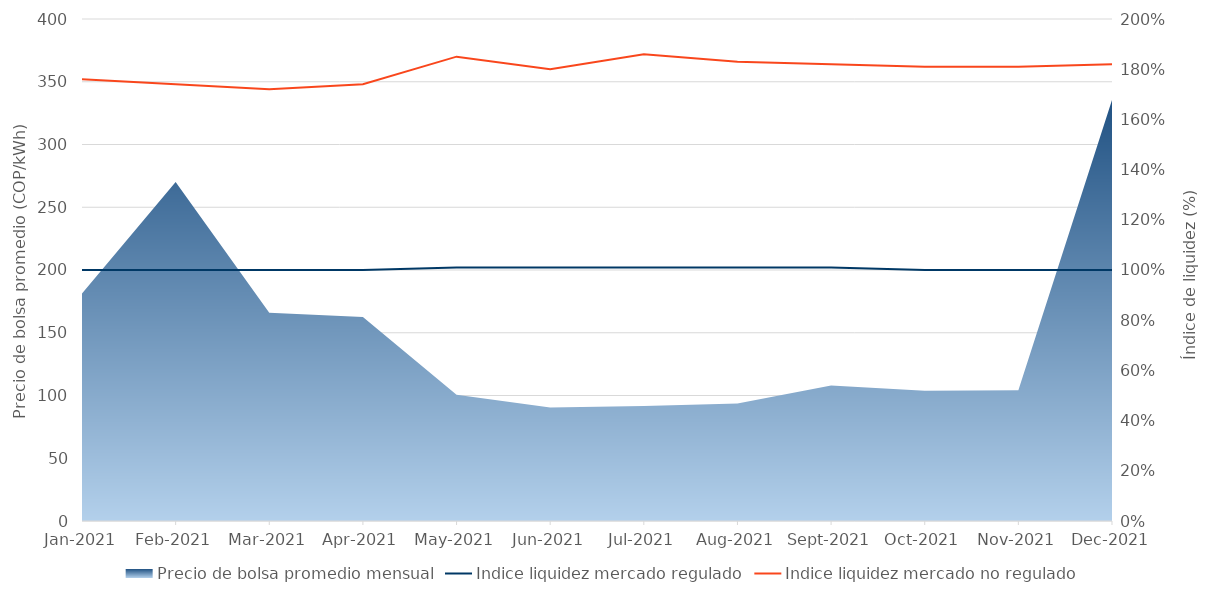
| Category | Indice liquidez mercado regulado | Indice liquidez mercado no regulado |
|---|---|---|
| 2021-01-01 | 1 | 1.76 |
| 2021-02-01 | 1 | 1.74 |
| 2021-03-01 | 1 | 1.72 |
| 2021-04-01 | 1 | 1.74 |
| 2021-05-01 | 1.01 | 1.85 |
| 2021-06-01 | 1.01 | 1.8 |
| 2021-07-01 | 1.01 | 1.86 |
| 2021-08-01 | 1.01 | 1.83 |
| 2021-09-01 | 1.01 | 1.82 |
| 2021-10-01 | 1 | 1.81 |
| 2021-11-01 | 1 | 1.81 |
| 2021-12-01 | 1 | 1.82 |